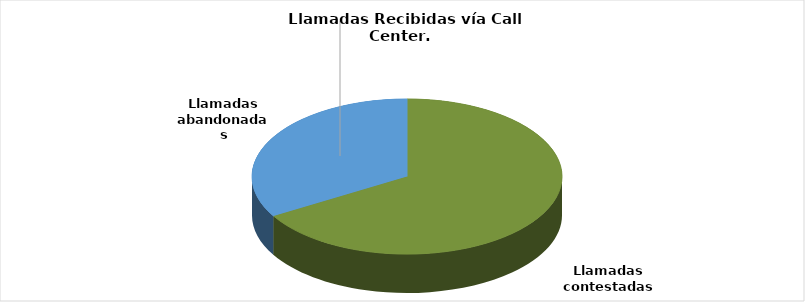
| Category | Enero-Diciembre |
|---|---|
| Llamadas contestadas | 181315 |
| Llamadas abandonadas | 91366 |